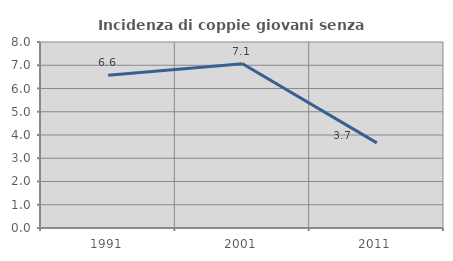
| Category | Incidenza di coppie giovani senza figli |
|---|---|
| 1991.0 | 6.567 |
| 2001.0 | 7.068 |
| 2011.0 | 3.661 |